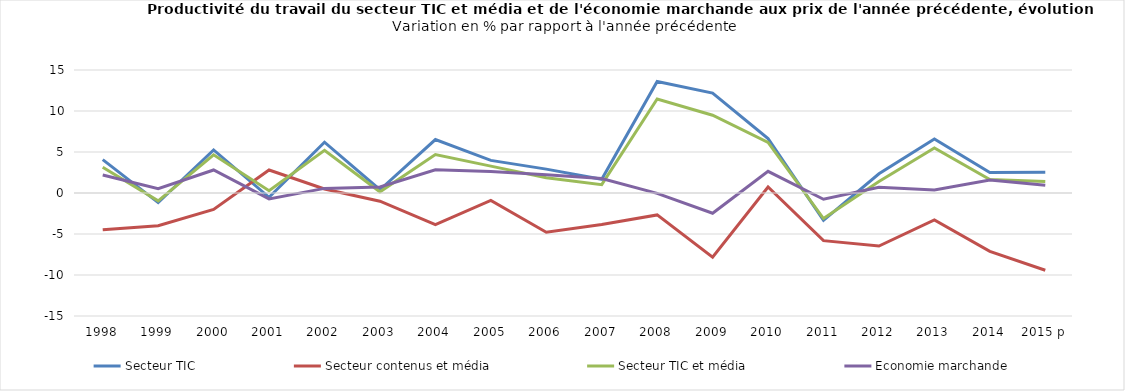
| Category | Secteur TIC | Secteur contenus et média | Secteur TIC et média | Economie marchande |
|---|---|---|---|---|
| 1998 | 4.07 | -4.485 | 3.135 | 2.197 |
| 1999 | -1.175 | -3.991 | -0.964 | 0.52 |
| 2000 | 5.248 | -2.001 | 4.66 | 2.808 |
| 2001 | -0.523 | 2.808 | 0.28 | -0.72 |
| 2002 | 6.196 | 0.49 | 5.213 | 0.563 |
| 2003 | 0.395 | -1.003 | 0.146 | 0.745 |
| 2004 | 6.521 | -3.856 | 4.698 | 2.836 |
| 2005 | 3.976 | -0.904 | 3.279 | 2.607 |
| 2006 | 2.91 | -4.793 | 1.857 | 2.232 |
| 2007 | 1.675 | -3.84 | 1.016 | 1.758 |
| 2008 | 13.603 | -2.672 | 11.468 | -0.038 |
| 2009 | 12.192 | -7.829 | 9.482 | -2.463 |
| 2010 | 6.641 | 0.728 | 6.173 | 2.643 |
| 2011 | -3.328 | -5.811 | -3.118 | -0.759 |
| 2012 | 2.343 | -6.47 | 1.413 | 0.691 |
| 2013 | 6.592 | -3.273 | 5.49 | 0.37 |
| 2014 | 2.487 | -7.118 | 1.638 | 1.587 |
| 2015 p | 2.524 | -9.418 | 1.411 | 0.948 |